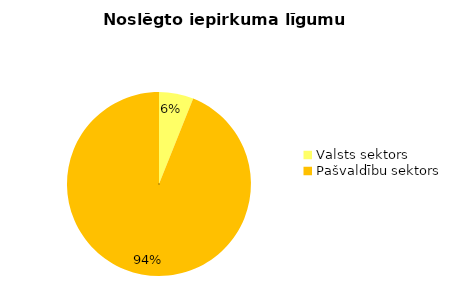
| Category | Noslēgto iepirkuma līgumu skaits |
|---|---|
| Valsts sektors | 6 |
| Pašvaldību sektors | 93 |